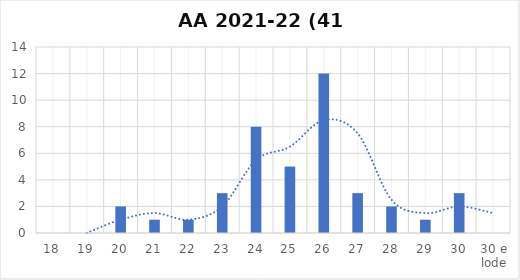
| Category | Series 0 |
|---|---|
| 18 | 0 |
| 19 | 0 |
| 20 | 2 |
| 21 | 1 |
| 22 | 1 |
| 23 | 3 |
| 24 | 8 |
| 25 | 5 |
| 26 | 12 |
| 27 | 3 |
| 28 | 2 |
| 29 | 1 |
| 30 | 3 |
| 30 e lode | 0 |